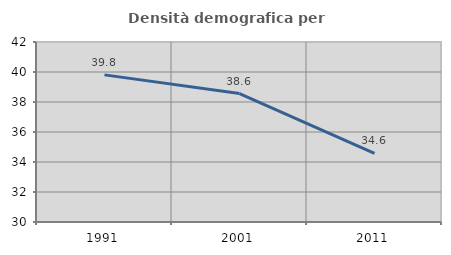
| Category | Densità demografica |
|---|---|
| 1991.0 | 39.808 |
| 2001.0 | 38.559 |
| 2011.0 | 34.579 |